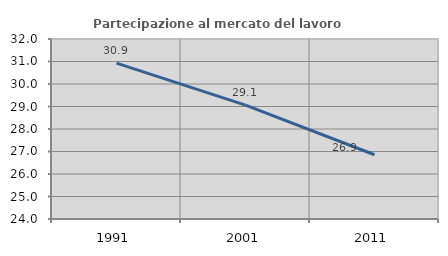
| Category | Partecipazione al mercato del lavoro  femminile |
|---|---|
| 1991.0 | 30.928 |
| 2001.0 | 29.063 |
| 2011.0 | 26.855 |